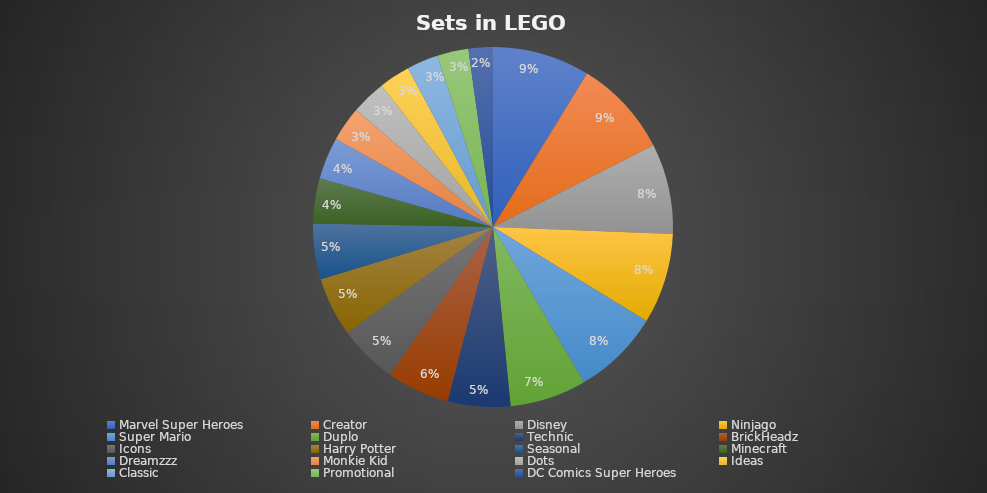
| Category | Series 0 |
|---|---|
| Marvel Super Heroes | 28 |
| Creator | 28 |
| Disney | 26 |
| Ninjago | 26 |
| Super Mario | 25 |
| Duplo | 22 |
| Technic | 18 |
| BrickHeadz | 18 |
| Icons | 17 |
| Harry Potter | 17 |
| Seasonal | 16 |
| Minecraft | 13 |
| Dreamzzz | 12 |
| Monkie Kid | 10 |
| Dots | 10 |
| Ideas | 9 |
| Classic | 9 |
| Promotional | 9 |
| DC Comics Super Heroes | 7 |